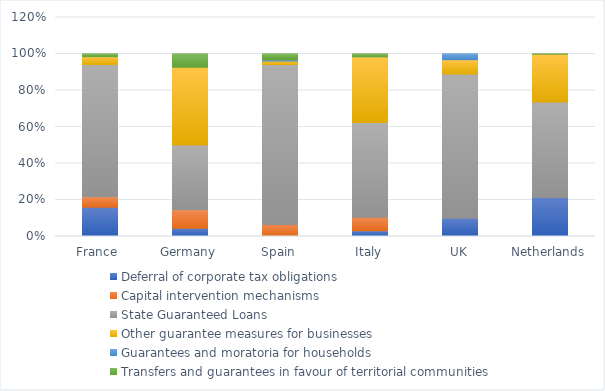
| Category | Deferral of corporate tax obligations | Capital intervention mechanisms | State Guaranteed Loans | Other guarantee measures for businesses | Guarantees and moratoria for households | Transfers and guarantees in favour of territorial communities |
|---|---|---|---|---|---|---|
| France  | 0.16 | 0.058 | 0.724 | 0.043 | 0 | 0.015 |
| Germany | 0.045 | 0.101 | 0.355 | 0.426 | 0 | 0.073 |
| Spain | 0.004 | 0.062 | 0.877 | 0.019 | 0.007 | 0.031 |
| Italy | 0.032 | 0.074 | 0.519 | 0.36 | 0 | 0.016 |
| UK | 0.1 | 0 | 0.79 | 0.079 | 0.031 | 0 |
| Netherlands | 0.214 | 0 | 0.523 | 0.261 | 0 | 0.002 |